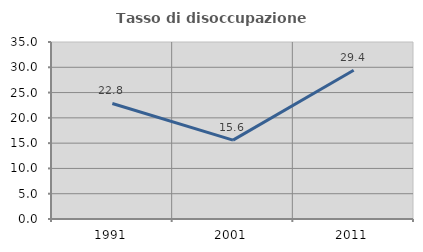
| Category | Tasso di disoccupazione giovanile  |
|---|---|
| 1991.0 | 22.84 |
| 2001.0 | 15.596 |
| 2011.0 | 29.412 |